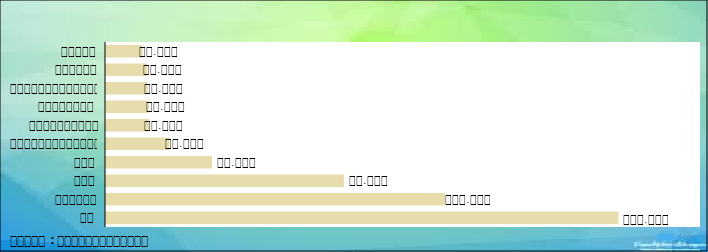
| Category | Series 0 |
|---|---|
| ថៃ | 172251 |
| វៀតណាម | 114006 |
| ចិន | 79971 |
| ឡាវ | 35625 |
| សហរដ្ឋអាមេរិក | 21378 |
| ឥណ្ឌូនេស៊ី | 14605 |
| អង់គ្លេស  | 14363 |
| កូរ៉េខាងត្បូង | 14022 |
| បារាំង | 13843 |
| ជប៉ុន | 12280 |